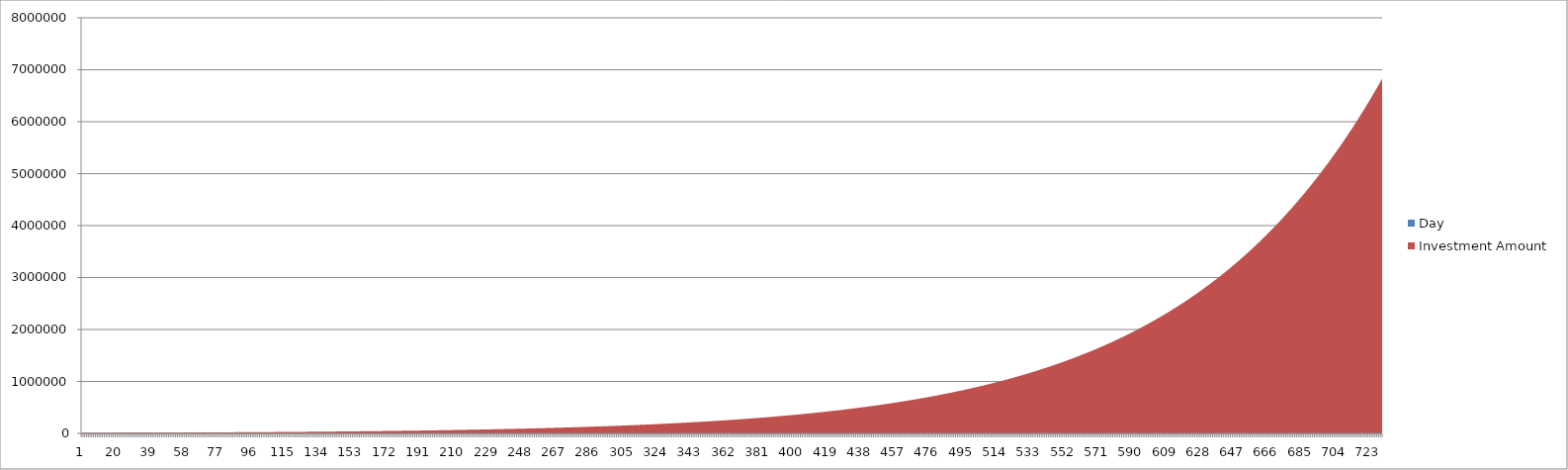
| Category | Day | Investment Amount |
|---|---|---|
| 0 | 1 | 10000 |
| 1 | 2 | 10090 |
| 2 | 3 | 10180 |
| 3 | 4 | 10270 |
| 4 | 5 | 10360 |
| 5 | 6 | 10450 |
| 6 | 7 | 10550 |
| 7 | 8 | 10640 |
| 8 | 9 | 10740 |
| 9 | 10 | 10830 |
| 10 | 11 | 10930 |
| 11 | 12 | 11030 |
| 12 | 13 | 11130 |
| 13 | 14 | 11230 |
| 14 | 15 | 11330 |
| 15 | 16 | 11430 |
| 16 | 17 | 11540 |
| 17 | 18 | 11640 |
| 18 | 19 | 11740 |
| 19 | 20 | 11850 |
| 20 | 21 | 11960 |
| 21 | 22 | 12060 |
| 22 | 23 | 12170 |
| 23 | 24 | 12280 |
| 24 | 25 | 12390 |
| 25 | 26 | 12500 |
| 26 | 27 | 12620 |
| 27 | 28 | 12730 |
| 28 | 29 | 12850 |
| 29 | 30 | 12960 |
| 30 | 31 | 13080 |
| 31 | 32 | 13200 |
| 32 | 33 | 13310 |
| 33 | 34 | 13430 |
| 34 | 35 | 13550 |
| 35 | 36 | 13680 |
| 36 | 37 | 13800 |
| 37 | 38 | 13920 |
| 38 | 39 | 14050 |
| 39 | 40 | 14180 |
| 40 | 41 | 14300 |
| 41 | 42 | 14430 |
| 42 | 43 | 14560 |
| 43 | 44 | 14690 |
| 44 | 45 | 14820 |
| 45 | 46 | 14960 |
| 46 | 47 | 15090 |
| 47 | 48 | 15230 |
| 48 | 49 | 15370 |
| 49 | 50 | 15500 |
| 50 | 51 | 15640 |
| 51 | 52 | 15780 |
| 52 | 53 | 15930 |
| 53 | 54 | 16070 |
| 54 | 55 | 16210 |
| 55 | 56 | 16360 |
| 56 | 57 | 16510 |
| 57 | 58 | 16660 |
| 58 | 59 | 16810 |
| 59 | 60 | 16960 |
| 60 | 61 | 17110 |
| 61 | 62 | 17260 |
| 62 | 63 | 17420 |
| 63 | 64 | 17580 |
| 64 | 65 | 17730 |
| 65 | 66 | 17890 |
| 66 | 67 | 18050 |
| 67 | 68 | 18220 |
| 68 | 69 | 18380 |
| 69 | 70 | 18550 |
| 70 | 71 | 18710 |
| 71 | 72 | 18880 |
| 72 | 73 | 19050 |
| 73 | 74 | 19220 |
| 74 | 75 | 19400 |
| 75 | 76 | 19570 |
| 76 | 77 | 19750 |
| 77 | 78 | 19920 |
| 78 | 79 | 20100 |
| 79 | 80 | 20290 |
| 80 | 81 | 20470 |
| 81 | 82 | 20650 |
| 82 | 83 | 20840 |
| 83 | 84 | 21030 |
| 84 | 85 | 21210 |
| 85 | 86 | 21410 |
| 86 | 87 | 21600 |
| 87 | 88 | 21790 |
| 88 | 89 | 21990 |
| 89 | 90 | 22190 |
| 90 | 91 | 22390 |
| 91 | 92 | 22590 |
| 92 | 93 | 22790 |
| 93 | 94 | 23000 |
| 94 | 95 | 23200 |
| 95 | 96 | 23410 |
| 96 | 97 | 23620 |
| 97 | 98 | 23840 |
| 98 | 99 | 24050 |
| 99 | 100 | 24270 |
| 100 | 101 | 24480 |
| 101 | 102 | 24710 |
| 102 | 103 | 24930 |
| 103 | 104 | 25150 |
| 104 | 105 | 25380 |
| 105 | 106 | 25610 |
| 106 | 107 | 25840 |
| 107 | 108 | 26070 |
| 108 | 109 | 26300 |
| 109 | 110 | 26540 |
| 110 | 111 | 26780 |
| 111 | 112 | 27020 |
| 112 | 113 | 27260 |
| 113 | 114 | 27510 |
| 114 | 115 | 27760 |
| 115 | 116 | 28010 |
| 116 | 117 | 28260 |
| 117 | 118 | 28510 |
| 118 | 119 | 28770 |
| 119 | 120 | 29030 |
| 120 | 121 | 29290 |
| 121 | 122 | 29550 |
| 122 | 123 | 29820 |
| 123 | 124 | 30090 |
| 124 | 125 | 30360 |
| 125 | 126 | 30630 |
| 126 | 127 | 30910 |
| 127 | 128 | 31190 |
| 128 | 129 | 31470 |
| 129 | 130 | 31750 |
| 130 | 131 | 32040 |
| 131 | 132 | 32320 |
| 132 | 133 | 32610 |
| 133 | 134 | 32910 |
| 134 | 135 | 33200 |
| 135 | 136 | 33500 |
| 136 | 137 | 33800 |
| 137 | 138 | 34110 |
| 138 | 139 | 34420 |
| 139 | 140 | 34730 |
| 140 | 141 | 35040 |
| 141 | 142 | 35350 |
| 142 | 143 | 35670 |
| 143 | 144 | 35990 |
| 144 | 145 | 36320 |
| 145 | 146 | 36640 |
| 146 | 147 | 36970 |
| 147 | 148 | 37310 |
| 148 | 149 | 37640 |
| 149 | 150 | 37980 |
| 150 | 151 | 38320 |
| 151 | 152 | 38670 |
| 152 | 153 | 39020 |
| 153 | 154 | 39370 |
| 154 | 155 | 39720 |
| 155 | 156 | 40080 |
| 156 | 157 | 40440 |
| 157 | 158 | 40800 |
| 158 | 159 | 41170 |
| 159 | 160 | 41540 |
| 160 | 161 | 41910 |
| 161 | 162 | 42290 |
| 162 | 163 | 42670 |
| 163 | 164 | 43060 |
| 164 | 165 | 43440 |
| 165 | 166 | 43840 |
| 166 | 167 | 44230 |
| 167 | 168 | 44630 |
| 168 | 169 | 45030 |
| 169 | 170 | 45430 |
| 170 | 171 | 45840 |
| 171 | 172 | 46260 |
| 172 | 173 | 46670 |
| 173 | 174 | 47090 |
| 174 | 175 | 47520 |
| 175 | 176 | 47940 |
| 176 | 177 | 48380 |
| 177 | 178 | 48810 |
| 178 | 179 | 49250 |
| 179 | 180 | 49690 |
| 180 | 181 | 50140 |
| 181 | 182 | 50590 |
| 182 | 183 | 51050 |
| 183 | 184 | 51510 |
| 184 | 185 | 51970 |
| 185 | 186 | 52440 |
| 186 | 187 | 52910 |
| 187 | 188 | 53390 |
| 188 | 189 | 53870 |
| 189 | 190 | 54350 |
| 190 | 191 | 54840 |
| 191 | 192 | 55330 |
| 192 | 193 | 55830 |
| 193 | 194 | 56330 |
| 194 | 195 | 56840 |
| 195 | 196 | 57350 |
| 196 | 197 | 57870 |
| 197 | 198 | 58390 |
| 198 | 199 | 58920 |
| 199 | 200 | 59450 |
| 200 | 201 | 59980 |
| 201 | 202 | 60520 |
| 202 | 203 | 61070 |
| 203 | 204 | 61620 |
| 204 | 205 | 62170 |
| 205 | 206 | 62730 |
| 206 | 207 | 63290 |
| 207 | 208 | 63860 |
| 208 | 209 | 64440 |
| 209 | 210 | 65020 |
| 210 | 211 | 65600 |
| 211 | 212 | 66190 |
| 212 | 213 | 66790 |
| 213 | 214 | 67390 |
| 214 | 215 | 68000 |
| 215 | 216 | 68610 |
| 216 | 217 | 69230 |
| 217 | 218 | 69850 |
| 218 | 219 | 70480 |
| 219 | 220 | 71110 |
| 220 | 221 | 71750 |
| 221 | 222 | 72400 |
| 222 | 223 | 73050 |
| 223 | 224 | 73710 |
| 224 | 225 | 74370 |
| 225 | 226 | 75040 |
| 226 | 227 | 75720 |
| 227 | 228 | 76400 |
| 228 | 229 | 77080 |
| 229 | 230 | 77780 |
| 230 | 231 | 78480 |
| 231 | 232 | 79180 |
| 232 | 233 | 79900 |
| 233 | 234 | 80620 |
| 234 | 235 | 81340 |
| 235 | 236 | 82070 |
| 236 | 237 | 82810 |
| 237 | 238 | 83560 |
| 238 | 239 | 84310 |
| 239 | 240 | 85070 |
| 240 | 241 | 85830 |
| 241 | 242 | 86610 |
| 242 | 243 | 87390 |
| 243 | 244 | 88170 |
| 244 | 245 | 88970 |
| 245 | 246 | 89770 |
| 246 | 247 | 90570 |
| 247 | 248 | 91390 |
| 248 | 249 | 92210 |
| 249 | 250 | 93040 |
| 250 | 251 | 93880 |
| 251 | 252 | 94720 |
| 252 | 253 | 95580 |
| 253 | 254 | 96440 |
| 254 | 255 | 97310 |
| 255 | 256 | 98180 |
| 256 | 257 | 99060 |
| 257 | 258 | 99960 |
| 258 | 259 | 100860 |
| 259 | 260 | 101760 |
| 260 | 261 | 102680 |
| 261 | 262 | 103600 |
| 262 | 263 | 104540 |
| 263 | 264 | 105480 |
| 264 | 265 | 106430 |
| 265 | 266 | 107380 |
| 266 | 267 | 108350 |
| 267 | 268 | 109330 |
| 268 | 269 | 110310 |
| 269 | 270 | 111300 |
| 270 | 271 | 112300 |
| 271 | 272 | 113310 |
| 272 | 273 | 114330 |
| 273 | 274 | 115360 |
| 274 | 275 | 116400 |
| 275 | 276 | 117450 |
| 276 | 277 | 118510 |
| 277 | 278 | 119570 |
| 278 | 279 | 120650 |
| 279 | 280 | 121740 |
| 280 | 281 | 122830 |
| 281 | 282 | 123940 |
| 282 | 283 | 125050 |
| 283 | 284 | 126180 |
| 284 | 285 | 127310 |
| 285 | 286 | 128460 |
| 286 | 287 | 129610 |
| 287 | 288 | 130780 |
| 288 | 289 | 131960 |
| 289 | 290 | 133150 |
| 290 | 291 | 134340 |
| 291 | 292 | 135550 |
| 292 | 293 | 136770 |
| 293 | 294 | 138000 |
| 294 | 295 | 139250 |
| 295 | 296 | 140500 |
| 296 | 297 | 141760 |
| 297 | 298 | 143040 |
| 298 | 299 | 144330 |
| 299 | 300 | 145630 |
| 300 | 301 | 146940 |
| 301 | 302 | 148260 |
| 302 | 303 | 149590 |
| 303 | 304 | 150940 |
| 304 | 305 | 152300 |
| 305 | 306 | 153670 |
| 306 | 307 | 155050 |
| 307 | 308 | 156450 |
| 308 | 309 | 157860 |
| 309 | 310 | 159280 |
| 310 | 311 | 160710 |
| 311 | 312 | 162160 |
| 312 | 313 | 163620 |
| 313 | 314 | 165090 |
| 314 | 315 | 166570 |
| 315 | 316 | 168070 |
| 316 | 317 | 169590 |
| 317 | 318 | 171110 |
| 318 | 319 | 172650 |
| 319 | 320 | 174210 |
| 320 | 321 | 175770 |
| 321 | 322 | 177360 |
| 322 | 323 | 178950 |
| 323 | 324 | 180560 |
| 324 | 325 | 182190 |
| 325 | 326 | 183830 |
| 326 | 327 | 185480 |
| 327 | 328 | 187150 |
| 328 | 329 | 188840 |
| 329 | 330 | 190530 |
| 330 | 331 | 192250 |
| 331 | 332 | 193980 |
| 332 | 333 | 195730 |
| 333 | 334 | 197490 |
| 334 | 335 | 199260 |
| 335 | 336 | 201060 |
| 336 | 337 | 202870 |
| 337 | 338 | 204690 |
| 338 | 339 | 206540 |
| 339 | 340 | 208390 |
| 340 | 341 | 210270 |
| 341 | 342 | 212160 |
| 342 | 343 | 214070 |
| 343 | 344 | 216000 |
| 344 | 345 | 217940 |
| 345 | 346 | 219900 |
| 346 | 347 | 221880 |
| 347 | 348 | 223880 |
| 348 | 349 | 225890 |
| 349 | 350 | 227930 |
| 350 | 351 | 229980 |
| 351 | 352 | 232050 |
| 352 | 353 | 234140 |
| 353 | 354 | 236240 |
| 354 | 355 | 238370 |
| 355 | 356 | 240520 |
| 356 | 357 | 242680 |
| 357 | 358 | 244870 |
| 358 | 359 | 247070 |
| 359 | 360 | 249290 |
| 360 | 361 | 251540 |
| 361 | 362 | 253800 |
| 362 | 363 | 256080 |
| 363 | 364 | 258390 |
| 364 | 365 | 260710 |
| 365 | 366 | 263060 |
| 366 | 367 | 265430 |
| 367 | 368 | 267820 |
| 368 | 369 | 270230 |
| 369 | 370 | 272660 |
| 370 | 371 | 275110 |
| 371 | 372 | 277590 |
| 372 | 373 | 280090 |
| 373 | 374 | 282610 |
| 374 | 375 | 285150 |
| 375 | 376 | 287720 |
| 376 | 377 | 290310 |
| 377 | 378 | 292920 |
| 378 | 379 | 295560 |
| 379 | 380 | 298220 |
| 380 | 381 | 300900 |
| 381 | 382 | 303610 |
| 382 | 383 | 306340 |
| 383 | 384 | 309100 |
| 384 | 385 | 311880 |
| 385 | 386 | 314690 |
| 386 | 387 | 317520 |
| 387 | 388 | 320380 |
| 388 | 389 | 323260 |
| 389 | 390 | 326170 |
| 390 | 391 | 329110 |
| 391 | 392 | 332070 |
| 392 | 393 | 335060 |
| 393 | 394 | 338070 |
| 394 | 395 | 341110 |
| 395 | 396 | 344180 |
| 396 | 397 | 347280 |
| 397 | 398 | 350410 |
| 398 | 399 | 353560 |
| 399 | 400 | 356740 |
| 400 | 401 | 359950 |
| 401 | 402 | 363190 |
| 402 | 403 | 366460 |
| 403 | 404 | 369760 |
| 404 | 405 | 373090 |
| 405 | 406 | 376450 |
| 406 | 407 | 379830 |
| 407 | 408 | 383250 |
| 408 | 409 | 386700 |
| 409 | 410 | 390180 |
| 410 | 411 | 393690 |
| 411 | 412 | 397240 |
| 412 | 413 | 400810 |
| 413 | 414 | 404420 |
| 414 | 415 | 408060 |
| 415 | 416 | 411730 |
| 416 | 417 | 415440 |
| 417 | 418 | 419180 |
| 418 | 419 | 422950 |
| 419 | 420 | 426760 |
| 420 | 421 | 430600 |
| 421 | 422 | 434470 |
| 422 | 423 | 438380 |
| 423 | 424 | 442330 |
| 424 | 425 | 446310 |
| 425 | 426 | 450330 |
| 426 | 427 | 454380 |
| 427 | 428 | 458470 |
| 428 | 429 | 462590 |
| 429 | 430 | 466760 |
| 430 | 431 | 470960 |
| 431 | 432 | 475200 |
| 432 | 433 | 479470 |
| 433 | 434 | 483790 |
| 434 | 435 | 488140 |
| 435 | 436 | 492540 |
| 436 | 437 | 496970 |
| 437 | 438 | 501440 |
| 438 | 439 | 505950 |
| 439 | 440 | 510510 |
| 440 | 441 | 515100 |
| 441 | 442 | 519740 |
| 442 | 443 | 524420 |
| 443 | 444 | 529140 |
| 444 | 445 | 533900 |
| 445 | 446 | 538700 |
| 446 | 447 | 543550 |
| 447 | 448 | 548440 |
| 448 | 449 | 553380 |
| 449 | 450 | 558360 |
| 450 | 451 | 563390 |
| 451 | 452 | 568460 |
| 452 | 453 | 573570 |
| 453 | 454 | 578730 |
| 454 | 455 | 583940 |
| 455 | 456 | 589200 |
| 456 | 457 | 594500 |
| 457 | 458 | 599850 |
| 458 | 459 | 605250 |
| 459 | 460 | 610700 |
| 460 | 461 | 616190 |
| 461 | 462 | 621740 |
| 462 | 463 | 627330 |
| 463 | 464 | 632980 |
| 464 | 465 | 638680 |
| 465 | 466 | 644430 |
| 466 | 467 | 650230 |
| 467 | 468 | 656080 |
| 468 | 469 | 661980 |
| 469 | 470 | 667940 |
| 470 | 471 | 673950 |
| 471 | 472 | 680020 |
| 472 | 473 | 686140 |
| 473 | 474 | 692310 |
| 474 | 475 | 698540 |
| 475 | 476 | 704830 |
| 476 | 477 | 711170 |
| 477 | 478 | 717570 |
| 478 | 479 | 724030 |
| 479 | 480 | 730550 |
| 480 | 481 | 737120 |
| 481 | 482 | 743760 |
| 482 | 483 | 750450 |
| 483 | 484 | 757210 |
| 484 | 485 | 764020 |
| 485 | 486 | 770900 |
| 486 | 487 | 777830 |
| 487 | 488 | 784840 |
| 488 | 489 | 791900 |
| 489 | 490 | 799030 |
| 490 | 491 | 806220 |
| 491 | 492 | 813470 |
| 492 | 493 | 820790 |
| 493 | 494 | 828180 |
| 494 | 495 | 835640 |
| 495 | 496 | 843160 |
| 496 | 497 | 850740 |
| 497 | 498 | 858400 |
| 498 | 499 | 866130 |
| 499 | 500 | 873920 |
| 500 | 501 | 881790 |
| 501 | 502 | 889720 |
| 502 | 503 | 897730 |
| 503 | 504 | 905810 |
| 504 | 505 | 913960 |
| 505 | 506 | 922190 |
| 506 | 507 | 930490 |
| 507 | 508 | 938860 |
| 508 | 509 | 947310 |
| 509 | 510 | 955840 |
| 510 | 511 | 964440 |
| 511 | 512 | 973120 |
| 512 | 513 | 981880 |
| 513 | 514 | 990720 |
| 514 | 515 | 999630 |
| 515 | 516 | 1008630 |
| 516 | 517 | 1017710 |
| 517 | 518 | 1026870 |
| 518 | 519 | 1036110 |
| 519 | 520 | 1045430 |
| 520 | 521 | 1054840 |
| 521 | 522 | 1064330 |
| 522 | 523 | 1073910 |
| 523 | 524 | 1083580 |
| 524 | 525 | 1093330 |
| 525 | 526 | 1103170 |
| 526 | 527 | 1113100 |
| 527 | 528 | 1123120 |
| 528 | 529 | 1133230 |
| 529 | 530 | 1143420 |
| 530 | 531 | 1153720 |
| 531 | 532 | 1164100 |
| 532 | 533 | 1174580 |
| 533 | 534 | 1185150 |
| 534 | 535 | 1195810 |
| 535 | 536 | 1206580 |
| 536 | 537 | 1217440 |
| 537 | 538 | 1228390 |
| 538 | 539 | 1239450 |
| 539 | 540 | 1250600 |
| 540 | 541 | 1261860 |
| 541 | 542 | 1273210 |
| 542 | 543 | 1284670 |
| 543 | 544 | 1296240 |
| 544 | 545 | 1307900 |
| 545 | 546 | 1319670 |
| 546 | 547 | 1331550 |
| 547 | 548 | 1343530 |
| 548 | 549 | 1355630 |
| 549 | 550 | 1367830 |
| 550 | 551 | 1380140 |
| 551 | 552 | 1392560 |
| 552 | 553 | 1405090 |
| 553 | 554 | 1417740 |
| 554 | 555 | 1430500 |
| 555 | 556 | 1443370 |
| 556 | 557 | 1456360 |
| 557 | 558 | 1469470 |
| 558 | 559 | 1482690 |
| 559 | 560 | 1496040 |
| 560 | 561 | 1509500 |
| 561 | 562 | 1523090 |
| 562 | 563 | 1536800 |
| 563 | 564 | 1550630 |
| 564 | 565 | 1564580 |
| 565 | 566 | 1578660 |
| 566 | 567 | 1592870 |
| 567 | 568 | 1607210 |
| 568 | 569 | 1621670 |
| 569 | 570 | 1636270 |
| 570 | 571 | 1650990 |
| 571 | 572 | 1665850 |
| 572 | 573 | 1680850 |
| 573 | 574 | 1695970 |
| 574 | 575 | 1711240 |
| 575 | 576 | 1726640 |
| 576 | 577 | 1742180 |
| 577 | 578 | 1757860 |
| 578 | 579 | 1773680 |
| 579 | 580 | 1789640 |
| 580 | 581 | 1805750 |
| 581 | 582 | 1822000 |
| 582 | 583 | 1838400 |
| 583 | 584 | 1854940 |
| 584 | 585 | 1871640 |
| 585 | 586 | 1888480 |
| 586 | 587 | 1905480 |
| 587 | 588 | 1922630 |
| 588 | 589 | 1939930 |
| 589 | 590 | 1957390 |
| 590 | 591 | 1975010 |
| 591 | 592 | 1992780 |
| 592 | 593 | 2010720 |
| 593 | 594 | 2028810 |
| 594 | 595 | 2047070 |
| 595 | 596 | 2065500 |
| 596 | 597 | 2084090 |
| 597 | 598 | 2102840 |
| 598 | 599 | 2121770 |
| 599 | 600 | 2140870 |
| 600 | 601 | 2160130 |
| 601 | 602 | 2179570 |
| 602 | 603 | 2199190 |
| 603 | 604 | 2218980 |
| 604 | 605 | 2238950 |
| 605 | 606 | 2259100 |
| 606 | 607 | 2279440 |
| 607 | 608 | 2299950 |
| 608 | 609 | 2320650 |
| 609 | 610 | 2341540 |
| 610 | 611 | 2362610 |
| 611 | 612 | 2383870 |
| 612 | 613 | 2405330 |
| 613 | 614 | 2426980 |
| 614 | 615 | 2448820 |
| 615 | 616 | 2470860 |
| 616 | 617 | 2493100 |
| 617 | 618 | 2515530 |
| 618 | 619 | 2538170 |
| 619 | 620 | 2561020 |
| 620 | 621 | 2584070 |
| 621 | 622 | 2607320 |
| 622 | 623 | 2630790 |
| 623 | 624 | 2654470 |
| 624 | 625 | 2678360 |
| 625 | 626 | 2702460 |
| 626 | 627 | 2726780 |
| 627 | 628 | 2751330 |
| 628 | 629 | 2776090 |
| 629 | 630 | 2801070 |
| 630 | 631 | 2826280 |
| 631 | 632 | 2851720 |
| 632 | 633 | 2877380 |
| 633 | 634 | 2903280 |
| 634 | 635 | 2929410 |
| 635 | 636 | 2955770 |
| 636 | 637 | 2982380 |
| 637 | 638 | 3009220 |
| 638 | 639 | 3036300 |
| 639 | 640 | 3063630 |
| 640 | 641 | 3091200 |
| 641 | 642 | 3119020 |
| 642 | 643 | 3147090 |
| 643 | 644 | 3175420 |
| 644 | 645 | 3203990 |
| 645 | 646 | 3232830 |
| 646 | 647 | 3261930 |
| 647 | 648 | 3291280 |
| 648 | 649 | 3320900 |
| 649 | 650 | 3350790 |
| 650 | 651 | 3380950 |
| 651 | 652 | 3411380 |
| 652 | 653 | 3442080 |
| 653 | 654 | 3473060 |
| 654 | 655 | 3504320 |
| 655 | 656 | 3535860 |
| 656 | 657 | 3567680 |
| 657 | 658 | 3599790 |
| 658 | 659 | 3632190 |
| 659 | 660 | 3664880 |
| 660 | 661 | 3697860 |
| 661 | 662 | 3731140 |
| 662 | 663 | 3764720 |
| 663 | 664 | 3798600 |
| 664 | 665 | 3832790 |
| 665 | 666 | 3867290 |
| 666 | 667 | 3902090 |
| 667 | 668 | 3937210 |
| 668 | 669 | 3972650 |
| 669 | 670 | 4008400 |
| 670 | 671 | 4044470 |
| 671 | 672 | 4080870 |
| 672 | 673 | 4117600 |
| 673 | 674 | 4154660 |
| 674 | 675 | 4192050 |
| 675 | 676 | 4229780 |
| 676 | 677 | 4267850 |
| 677 | 678 | 4306260 |
| 678 | 679 | 4345020 |
| 679 | 680 | 4384120 |
| 680 | 681 | 4423580 |
| 681 | 682 | 4463390 |
| 682 | 683 | 4503560 |
| 683 | 684 | 4544090 |
| 684 | 685 | 4584990 |
| 685 | 686 | 4626260 |
| 686 | 687 | 4667890 |
| 687 | 688 | 4709900 |
| 688 | 689 | 4752290 |
| 689 | 690 | 4795060 |
| 690 | 691 | 4838220 |
| 691 | 692 | 4881760 |
| 692 | 693 | 4925700 |
| 693 | 694 | 4970030 |
| 694 | 695 | 5014760 |
| 695 | 696 | 5059890 |
| 696 | 697 | 5105430 |
| 697 | 698 | 5151380 |
| 698 | 699 | 5197740 |
| 699 | 700 | 5244520 |
| 700 | 701 | 5291720 |
| 701 | 702 | 5339350 |
| 702 | 703 | 5387400 |
| 703 | 704 | 5435890 |
| 704 | 705 | 5484810 |
| 705 | 706 | 5534180 |
| 706 | 707 | 5583980 |
| 707 | 708 | 5634240 |
| 708 | 709 | 5684950 |
| 709 | 710 | 5736110 |
| 710 | 711 | 5787740 |
| 711 | 712 | 5839830 |
| 712 | 713 | 5892380 |
| 713 | 714 | 5945420 |
| 714 | 715 | 5998920 |
| 715 | 716 | 6052910 |
| 716 | 717 | 6107390 |
| 717 | 718 | 6162360 |
| 718 | 719 | 6217820 |
| 719 | 720 | 6273780 |
| 720 | 721 | 6330240 |
| 721 | 722 | 6387220 |
| 722 | 723 | 6444700 |
| 723 | 724 | 6502700 |
| 724 | 725 | 6561230 |
| 725 | 726 | 6620280 |
| 726 | 727 | 6679860 |
| 727 | 728 | 6739980 |
| 728 | 729 | 6800640 |
| 729 | 730 | 6861840 |